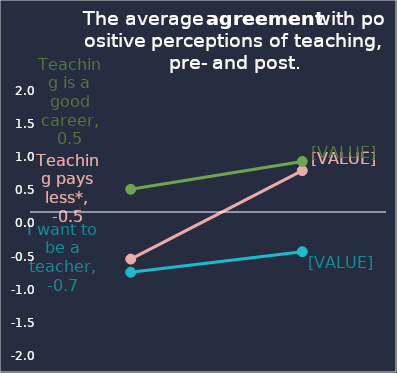
| Category | Teaching pays less* | I want to be a teacher | Teaching is a good career |
|---|---|---|---|
| Pre | -0.537 | -0.737 | 0.516 |
| Post | 0.798 | -0.426 | 0.937 |